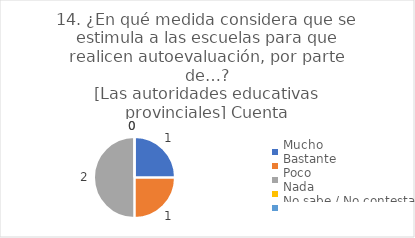
| Category | 14. ¿En qué medida considera que se estimula a las escuelas para que realicen autoevaluación, por parte de…?
[Las autoridades educativas provinciales] |
|---|---|
| Mucho  | 0.25 |
| Bastante  | 0.25 |
| Poco  | 0.5 |
| Nada  | 0 |
| No sabe / No contesta | 0 |